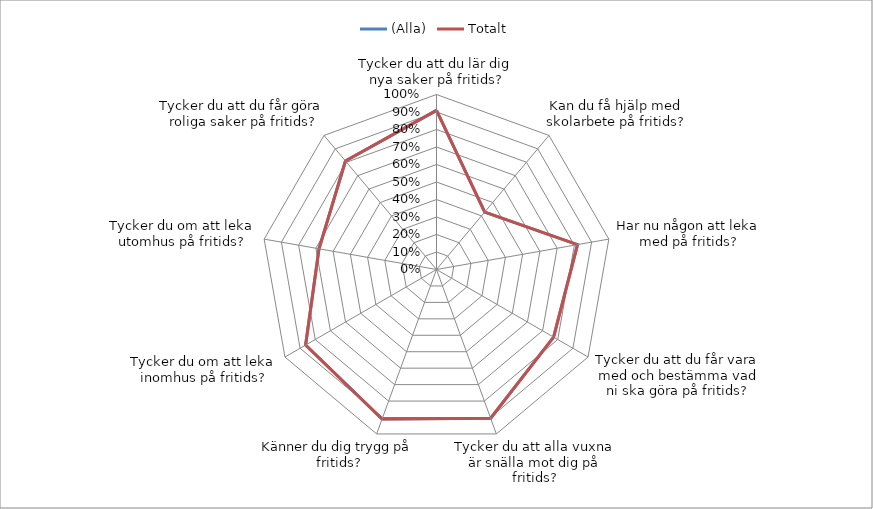
| Category | (Alla) | Totalt |
|---|---|---|
| Tycker du att du lär dig nya saker på fritids? | 0.909 | 0.909 |
| Kan du få hjälp med skolarbete på fritids? | 0.429 | 0.429 |
| Har nu någon att leka med på fritids? | 0.818 | 0.818 |
| Tycker du att du får vara med och bestämma vad ni ska göra på fritids? | 0.773 | 0.773 |
| Tycker du att alla vuxna är snälla mot dig på fritids? | 0.905 | 0.905 |
| Känner du dig trygg på fritids? | 0.909 | 0.909 |
| Tycker du om att leka inomhus på fritids? | 0.864 | 0.864 |
| Tycker du om att leka utomhus på fritids? | 0.682 | 0.682 |
| Tycker du att du får göra roliga saker på fritids? | 0.81 | 0.81 |